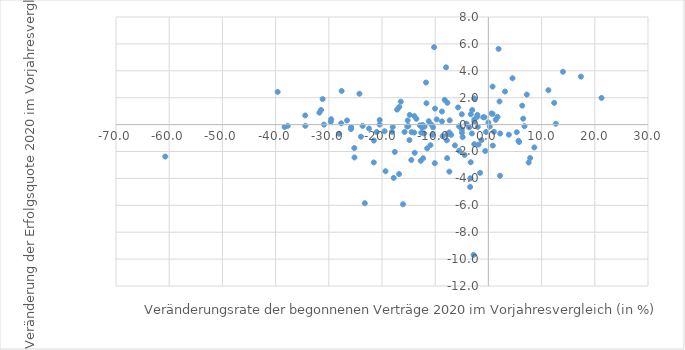
| Category | Series 0 |
|---|---|
| -60.73717948717948 | -2.375 |
| -39.61038961038961 | 2.431 |
| -38.30104321907601 | -0.177 |
| -37.71551724137931 | -0.093 |
| -34.4311377245509 | 0.68 |
| -34.41558441558442 | -0.089 |
| -31.775700934579437 | 0.889 |
| -31.46067415730337 | 1.085 |
| -31.15199034981906 | 1.896 |
| -30.909090909090907 | 0 |
| -29.629629629629626 | 0.212 |
| -29.553264604810998 | 0.397 |
| -28.07486631016043 | -0.68 |
| -27.66497461928934 | 0.094 |
| -27.586206896551722 | 2.5 |
| -26.573426573426573 | 0.307 |
| -25.823591923485655 | -0.33 |
| -25.817757009345794 | -0.191 |
| -25.209302325581394 | -1.743 |
| -25.170068027210885 | -2.442 |
| -24.242424242424242 | 2.294 |
| -23.958333333333336 | -0.9 |
| -23.647294589178355 | -0.092 |
| -23.23008849557522 | -5.845 |
| -22.4375 | -0.292 |
| -21.54903185509057 | -2.815 |
| -21.52152152152152 | -1.185 |
| -20.986411675893308 | -0.547 |
| -20.454545454545457 | 0 |
| -20.432692307692307 | 0.344 |
| -19.51219512195122 | -0.495 |
| -19.342872284048752 | -3.467 |
| -18.125 | -0.544 |
| -17.974971558589306 | -0.181 |
| -17.792421746293247 | -3.965 |
| -17.595307917888565 | -2.032 |
| -17.159763313609467 | 1.117 |
| -16.790792146242385 | -3.677 |
| -16.761363636363637 | 1.308 |
| -16.470588235294116 | 1.709 |
| -16.049382716049383 | -5.922 |
| -15.761821366024517 | -0.546 |
| -15.260115606936417 | -0.143 |
| -15.178571428571427 | 0.305 |
| -15.047021943573668 | -0.097 |
| -14.835826027161767 | -1.153 |
| -14.788732394366196 | 0.722 |
| -14.492753623188406 | -2.632 |
| -14.446157234089407 | -0.561 |
| -13.939393939393941 | -0.591 |
| -13.924050632911392 | 0.633 |
| -13.846153846153847 | -2.094 |
| -13.539192399049881 | 0.428 |
| -12.88488867835149 | -0.059 |
| -12.72294887039239 | -2.69 |
| -12.617283950617283 | -0.607 |
| -12.418300653594772 | -0.228 |
| -12.378303198887343 | -0.029 |
| -12.276729559748428 | -2.504 |
| -12.062135112593827 | -0.663 |
| -12.0 | -0.141 |
| -11.724137931034482 | 3.128 |
| -11.643835616438356 | 1.587 |
| -11.504811898512687 | -1.768 |
| -11.209439528023598 | 0.254 |
| -10.891089108910892 | -1.532 |
| -10.701754385964913 | -0.005 |
| -10.526315789473683 | -0.759 |
| -10.40027369141293 | -0.202 |
| -10.204081632653061 | 5.757 |
| -10.080183276059564 | -2.869 |
| -10.032017075773746 | 1.188 |
| -9.7165991902834 | 0.384 |
| -8.737864077669903 | 0.975 |
| -8.73015873015873 | 0.236 |
| -8.597472550238242 | -0.863 |
| -8.210526315789474 | 1.833 |
| -7.957957957957958 | 4.256 |
| -7.818109293976865 | -1.171 |
| -7.755102040816326 | -0.727 |
| -7.751937984496124 | -2.497 |
| -7.705779334500876 | 1.619 |
| -7.355292612727854 | -0.584 |
| -7.339449541284404 | -3.496 |
| -7.2727272727272725 | 0.316 |
| -7.00951039098274 | -0.763 |
| -6.297709923664121 | -1.547 |
| -5.6985855296631724 | 1.277 |
| -5.505505505505505 | -0.132 |
| -5.47945205479452 | -1.947 |
| -5.0 | 0.77 |
| -5.0 | -0.357 |
| -4.962406015037594 | -0.605 |
| -4.838709677419355 | -0.925 |
| -4.4609665427509295 | -2.254 |
| -4.102564102564102 | 0.066 |
| -3.6036036036036037 | -0.207 |
| -3.4334763948497855 | -4.636 |
| -3.389830508474576 | -3.996 |
| -3.3277870216306153 | -2.799 |
| -3.3112582781456954 | 0.769 |
| -3.1055900621118013 | -0.658 |
| -3.041262534933421 | 1.083 |
| -2.7777777777777777 | -9.688 |
| -2.6737967914438503 | 1.947 |
| -2.6548672566371683 | -1.453 |
| -2.642276422764228 | 0.381 |
| -2.638190954773869 | 0.206 |
| -2.119460500963391 | 0.581 |
| -2.0709020709020707 | 0.723 |
| -2.0 | -0.17 |
| -1.8478727975934681 | -1.485 |
| -1.5594541910331383 | -3.587 |
| -1.2958963282937366 | -1.16 |
| -0.98159509202454 | 0.542 |
| -0.7312614259597806 | 0.545 |
| -0.5916473317865429 | -1.962 |
| -0.4431314623338257 | -0.55 |
| 0.0 | 0.161 |
| 0.24808765763903248 | -0.141 |
| 0.5772005772005772 | 0.83 |
| 0.7874015748031495 | 2.826 |
| 0.7902298850574714 | 0.801 |
| 0.8264462809917356 | -1.561 |
| 1.0443864229765014 | -0.536 |
| 1.38718890248878 | 0.358 |
| 1.7241379310344827 | 0.576 |
| 1.910828025477707 | 5.63 |
| 2.094240837696335 | 1.72 |
| 2.1870286576168927 | -3.803 |
| 2.2157434402332363 | -0.664 |
| 3.125 | 2.459 |
| 3.8461538461538463 | -0.752 |
| 4.538799414348463 | 3.446 |
| 5.333333333333334 | -0.567 |
| 5.660377358490567 | -1.205 |
| 5.764411027568922 | -1.294 |
| 6.363636363636363 | 1.41 |
| 6.543075245365322 | 0.441 |
| 6.786427145708583 | -0.119 |
| 7.216494845360824 | 2.234 |
| 7.57238307349666 | -2.819 |
| 7.8431372549019605 | -2.486 |
| 8.633093525179856 | -1.697 |
| 11.278195488721805 | 2.556 |
| 12.36749116607774 | 1.613 |
| 12.672176308539946 | 0.06 |
| 14.018691588785046 | 3.929 |
| 17.391304347826086 | 3.567 |
| 21.25984251968504 | 1.985 |